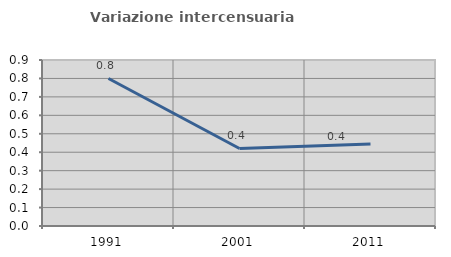
| Category | Variazione intercensuaria annua |
|---|---|
| 1991.0 | 0.8 |
| 2001.0 | 0.42 |
| 2011.0 | 0.445 |